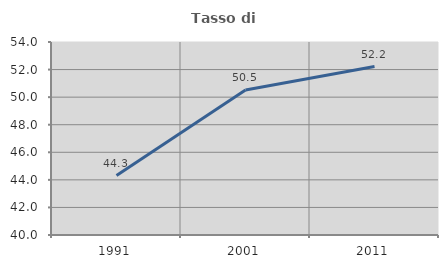
| Category | Tasso di occupazione   |
|---|---|
| 1991.0 | 44.315 |
| 2001.0 | 50.521 |
| 2011.0 | 52.216 |